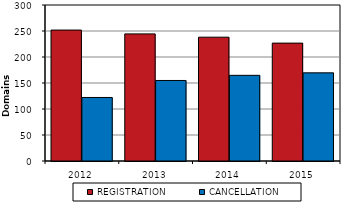
| Category | REGISTRATION | CANCELLATION |
|---|---|---|
| 2012.0 | 251778 | 122161 |
| 2013.0 | 244427 | 154846 |
| 2014.0 | 238101 | 164751 |
| 2015.0 | 226685 | 169544 |